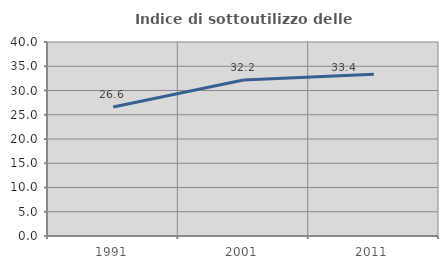
| Category | Indice di sottoutilizzo delle abitazioni  |
|---|---|
| 1991.0 | 26.604 |
| 2001.0 | 32.184 |
| 2011.0 | 33.363 |